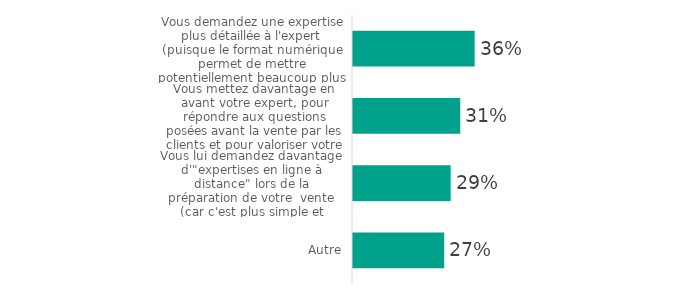
| Category | Series 0 |
|---|---|
| Vous demandez une expertise plus détaillée à l'expert (puisque le format numérique permet de mettre potentiellement beaucoup plus de contenus à disposition des enchérisseurs) | 35.685 |
| Vous mettez davantage en avant votre expert, pour répondre aux questions posées avant la vente par les clients et pour valoriser votre vente | 31.457 |
| Vous lui demandez davantage d'"expertises en ligne à distance" lors de la préparation de votre  vente (car c'est plus simple et rapide) | 28.649 |
| Autre | 26.755 |